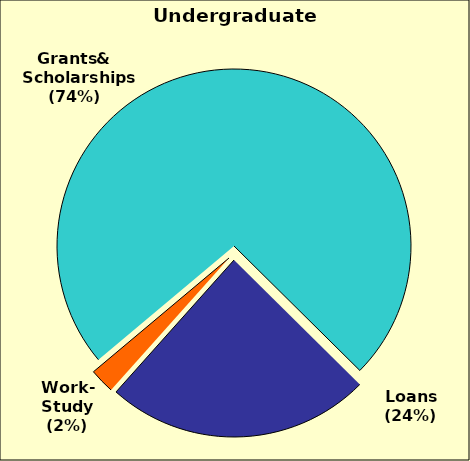
| Category | Series 0 |
|---|---|
| 0 | 0.735 |
| 1 | 0.242 |
| 2 | 0.023 |